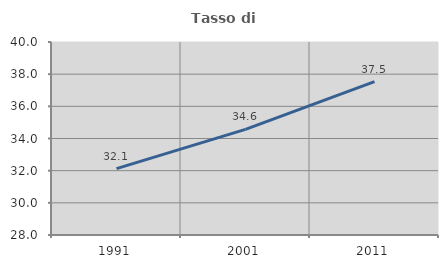
| Category | Tasso di occupazione   |
|---|---|
| 1991.0 | 32.13 |
| 2001.0 | 34.565 |
| 2011.0 | 37.54 |